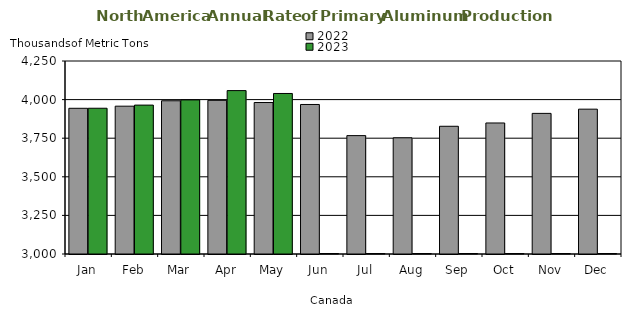
| Category | 2022 | 2023 |
|---|---|---|
| Jan | 3943.766 | 3943.978 |
| Feb | 3957.421 | 3964.33 |
| Mar | 3992.464 | 3997.975 |
| Apr | 3995.314 | 4058.289 |
| May | 3981.031 | 4039.667 |
| Jun | 3968.402 | 0 |
| Jul | 3766.729 | 0 |
| Aug | 3752.647 | 0 |
| Sep | 3827.195 | 0 |
| Oct | 3848.56 | 0 |
| Nov | 3910.719 | 0 |
| Dec | 3938.009 | 0 |